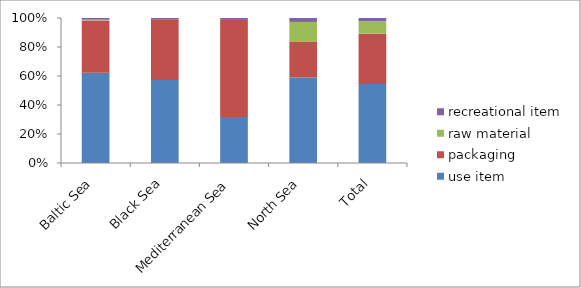
| Category | use item | packaging | raw material | recreational item |
|---|---|---|---|---|
| Baltic Sea | 13193 | 7646 | 105 | 246 |
| Black Sea | 3653 | 2676 | 0 | 58 |
| Mediterranean Sea | 8262 | 17371 | 4 | 350 |
| North Sea | 52050 | 21636 | 12168 | 2393 |
| Total | 77158 | 49329 | 12277 | 3047 |